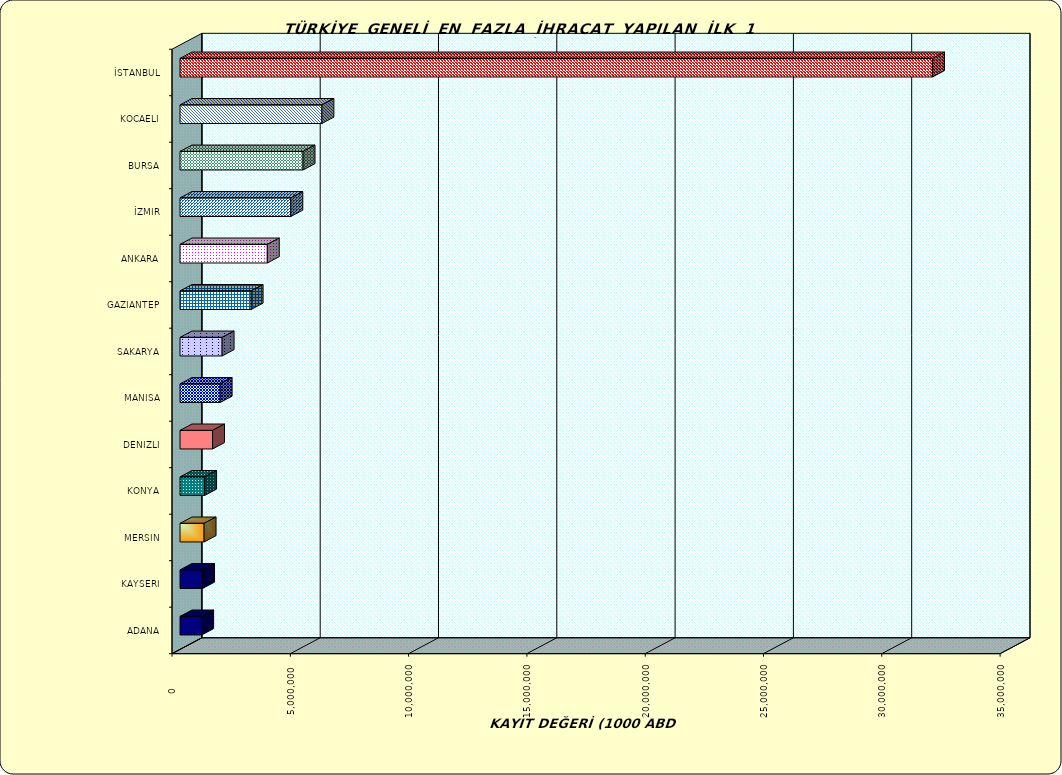
| Category | Series 0 |
|---|---|
| İSTANBUL | 31803557.479 |
| KOCAELI | 5997262.714 |
| BURSA | 5199557.877 |
| İZMIR | 4683187.539 |
| ANKARA | 3689690.809 |
| GAZIANTEP | 3006077.702 |
| SAKARYA | 1779259.318 |
| MANISA | 1696555.956 |
| DENIZLI | 1374516.495 |
| KONYA | 1039077.798 |
| MERSIN | 1018104.856 |
| KAYSERI | 952740.568 |
| ADANA | 914358.363 |